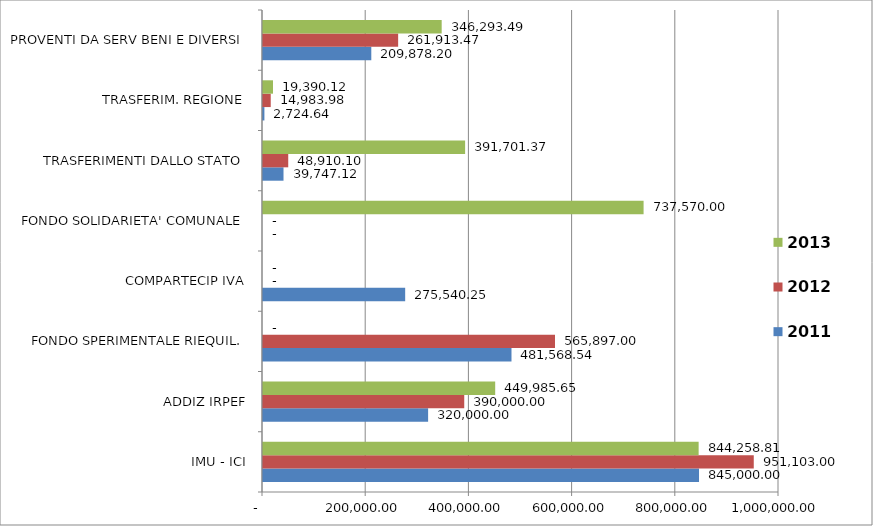
| Category | 2011 | 2012 | 2013 |
|---|---|---|---|
| IMU - ICI | 845000 | 951103 | 844258.81 |
| ADDIZ IRPEF | 320000 | 390000 | 449985.65 |
| FONDO SPERIMENTALE RIEQUIL. | 481568.54 | 565897 | 0 |
| COMPARTECIP IVA | 275540.25 | 0 | 0 |
| FONDO SOLIDARIETA' COMUNALE | 0 | 0 | 737570 |
| TRASFERIMENTI DALLO STATO | 39747.12 | 48910.1 | 391701.37 |
| TRASFERIM. REGIONE | 2724.64 | 14983.98 | 19390.12 |
| PROVENTI DA SERV BENI E DIVERSI | 209878.2 | 261913.47 | 346293.49 |